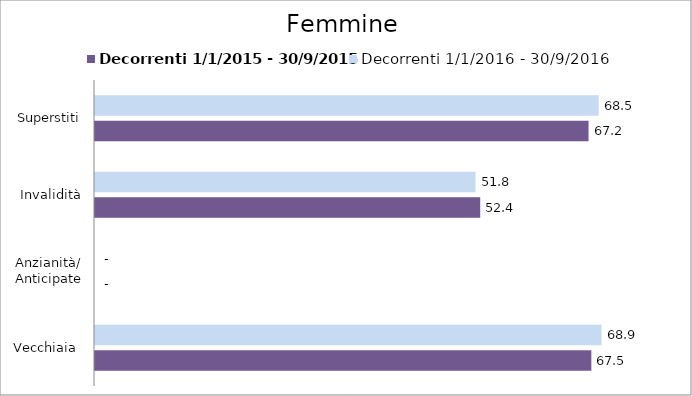
| Category | Decorrenti 1/1/2015 - 30/9/2015 | Decorrenti 1/1/2016 - 30/9/2016 |
|---|---|---|
| Vecchiaia  | 67.53 | 68.92 |
| Anzianità/ Anticipate | 0 | 0 |
| Invalidità | 52.41 | 51.77 |
| Superstiti | 67.15 | 68.53 |